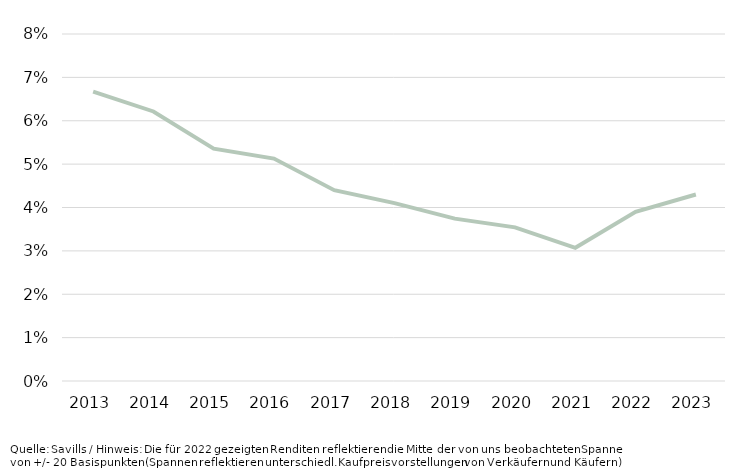
| Category | Spitzenrendite |
|---|---|
| 2013.0 | 0.067 |
| 2014.0 | 0.062 |
| 2015.0 | 0.054 |
| 2016.0 | 0.051 |
| 2017.0 | 0.044 |
| 2018.0 | 0.041 |
| 2019.0 | 0.037 |
| 2020.0 | 0.035 |
| 2021.0 | 0.031 |
| 2022.0 | 0.039 |
| 2023.0 | 0.043 |